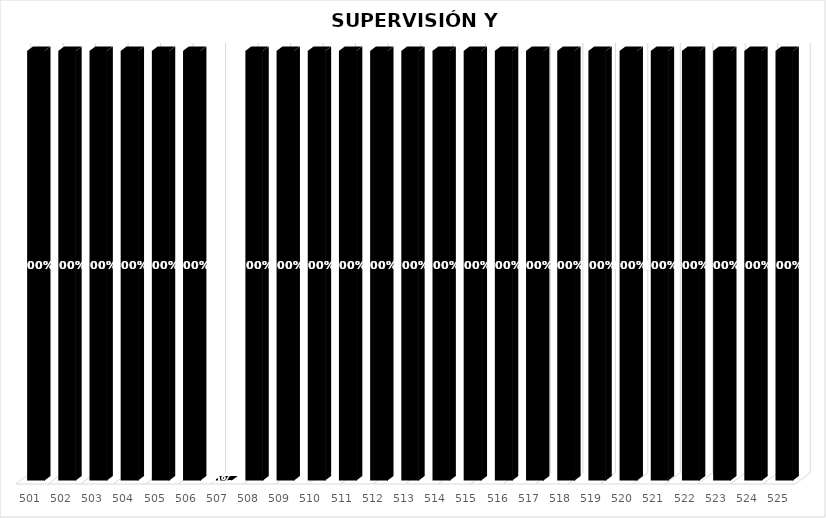
| Category | % Avance |
|---|---|
| 501.0 | 1 |
| 502.0 | 1 |
| 503.0 | 1 |
| 504.0 | 1 |
| 505.0 | 1 |
| 506.0 | 1 |
| 507.0 | 0 |
| 508.0 | 1 |
| 509.0 | 1 |
| 510.0 | 1 |
| 511.0 | 1 |
| 512.0 | 1 |
| 513.0 | 1 |
| 514.0 | 1 |
| 515.0 | 1 |
| 516.0 | 1 |
| 517.0 | 1 |
| 518.0 | 1 |
| 519.0 | 1 |
| 520.0 | 1 |
| 521.0 | 1 |
| 522.0 | 1 |
| 523.0 | 1 |
| 524.0 | 1 |
| 525.0 | 1 |